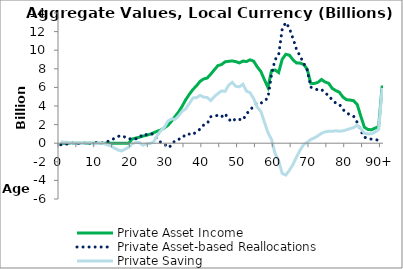
| Category | Private Asset Income | Private Asset-based Reallocations | Private Saving |
|---|---|---|---|
| 0 | 0 | -169.187 | 169.187 |
|  | 0 | -93.478 | 93.478 |
| 2 | 0 | -91.648 | 91.648 |
| 3 | 0 | 24.611 | -24.611 |
| 4 | 0 | -22.379 | 22.379 |
| 5 | 0 | -38.806 | 38.806 |
| 6 | 0 | 47.349 | -47.349 |
| 7 | 0 | -14.346 | 14.346 |
| 8 | 0 | -68.893 | 68.893 |
| 9 | 0 | 90.197 | -90.197 |
| 10 | 0 | 51.38 | -51.38 |
| 11 | 0 | -1.856 | 1.856 |
| 12 | 0 | 32.801 | -32.801 |
| 13 | 0 | 169.958 | -169.958 |
| 14 | 0 | 295.455 | -295.455 |
| 15 | 0 | 527.118 | -527.118 |
| 16 | 0 | 728.414 | -728.414 |
| 17 | 0.871 | 827.658 | -826.788 |
| 18 | 1.511 | 644.635 | -643.124 |
| 19 | 2.897 | 450.371 | -447.474 |
| 20 | 453.006 | 498.028 | -45.022 |
| 21 | 549.712 | 468.806 | 80.906 |
| 22 | 647.083 | 581.092 | 65.991 |
| 23 | 765.302 | 994.793 | -229.492 |
| 24 | 854.609 | 907.461 | -52.852 |
| 25 | 965.312 | 1004.383 | -39.072 |
| 26 | 1121.33 | 975.67 | 145.66 |
| 27 | 1286.255 | 457.424 | 828.83 |
| 28 | 1421.798 | 82.325 | 1339.473 |
| 29 | 1650.455 | -70.329 | 1720.783 |
| 30 | 1918.081 | -466.424 | 2384.506 |
| 31 | 2365.585 | -239.419 | 2605.003 |
| 32 | 2876.223 | 305.71 | 2570.514 |
| 33 | 3365.251 | 423.767 | 2941.484 |
| 34 | 3987.863 | 544.577 | 3443.286 |
| 35 | 4689.053 | 984.927 | 3704.125 |
| 36 | 5258.615 | 979.26 | 4279.355 |
| 37 | 5778.689 | 912.52 | 4866.169 |
| 38 | 6165.706 | 1270.237 | 4895.469 |
| 39 | 6648.714 | 1503.445 | 5145.269 |
| 40 | 6906.597 | 1954.385 | 4952.212 |
| 41 | 7008.538 | 2094.431 | 4914.106 |
| 42 | 7430.718 | 2849.354 | 4581.364 |
| 43 | 7894.49 | 2878.498 | 5015.992 |
| 44 | 8347.14 | 3014.958 | 5332.183 |
| 45 | 8454.223 | 2833.322 | 5620.901 |
| 46 | 8752.781 | 3179.218 | 5573.563 |
| 47 | 8807.253 | 2577.62 | 6229.633 |
| 48 | 8842.292 | 2297.509 | 6544.783 |
| 49 | 8770.576 | 2654.978 | 6115.598 |
| 50 | 8634.727 | 2562.782 | 6071.945 |
| 51 | 8832.613 | 2489.605 | 6343.008 |
| 52 | 8772.328 | 3170.88 | 5601.448 |
| 53 | 8966.926 | 3537.915 | 5429.011 |
| 54 | 8818.875 | 4015.675 | 4803.2 |
| 55 | 8209.024 | 4341.434 | 3867.59 |
| 56 | 7721.741 | 4288.368 | 3433.372 |
| 57 | 6843.989 | 4565.678 | 2278.311 |
| 58 | 6003.352 | 4855.502 | 1147.85 |
| 59 | 7791.133 | 7388.821 | 402.312 |
| 60 | 7874.047 | 8968.303 | -1094.257 |
| 61 | 7595.813 | 9490.215 | -1894.402 |
| 62 | 9026.793 | 12284.594 | -3257.8 |
| 63 | 9552.519 | 12976.293 | -3423.774 |
| 64 | 9468.734 | 12386.603 | -2917.869 |
| 65 | 8977.355 | 11277.849 | -2300.495 |
| 66 | 8621.101 | 10102.612 | -1481.51 |
| 67 | 8612.057 | 9356.923 | -744.866 |
| 68 | 8467.833 | 8615.289 | -147.456 |
| 69 | 7952.178 | 7856.839 | 95.339 |
| 70 | 6436.384 | 6037.178 | 399.206 |
| 71 | 6423.248 | 5850.822 | 572.426 |
| 72 | 6541.231 | 5743.868 | 797.364 |
| 73 | 6851.601 | 5789.289 | 1062.312 |
| 74 | 6580.88 | 5361.802 | 1219.078 |
| 75 | 6445.078 | 5167.571 | 1277.507 |
| 76 | 5892.725 | 4620.523 | 1272.201 |
| 77 | 5658.788 | 4317.193 | 1341.596 |
| 78 | 5477.627 | 4192.541 | 1285.086 |
| 79 | 4957.294 | 3626.811 | 1330.483 |
| 80 | 4679.012 | 3240.979 | 1438.033 |
| 81 | 4640.022 | 3070.252 | 1569.769 |
| 82 | 4565.078 | 2893.278 | 1671.8 |
| 83 | 4168.052 | 2240.033 | 1928.019 |
| 84 | 2908.885 | 1358.402 | 1550.483 |
| 85 | 1725.063 | 655.35 | 1069.713 |
| 86 | 1478.331 | 481.223 | 997.107 |
| 87 | 1445.376 | 436.481 | 1008.894 |
| 88 | 1622.165 | 416.749 | 1205.416 |
| 89 | 1780.327 | 299.129 | 1481.197 |
| 90+ | 6201.5 | 257.323 | 5944.177 |